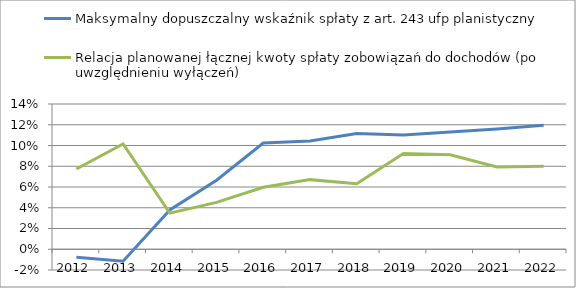
| Category | Maksymalny dopuszczalny wskaźnik spłaty z art. 243 ufp planistyczny | Relacja planowanej łącznej kwoty spłaty zobowiązań do dochodów (po uwzględnieniu wyłączeń) |
|---|---|---|
| 2012.0 | -0.008 | 0.077 |
| 2013.0 | -0.012 | 0.102 |
| 2014.0 | 0.038 | 0.035 |
| 2015.0 | 0.067 | 0.045 |
| 2016.0 | 0.102 | 0.06 |
| 2017.0 | 0.104 | 0.067 |
| 2018.0 | 0.112 | 0.063 |
| 2019.0 | 0.11 | 0.092 |
| 2020.0 | 0.113 | 0.091 |
| 2021.0 | 0.116 | 0.079 |
| 2022.0 | 0.12 | 0.08 |